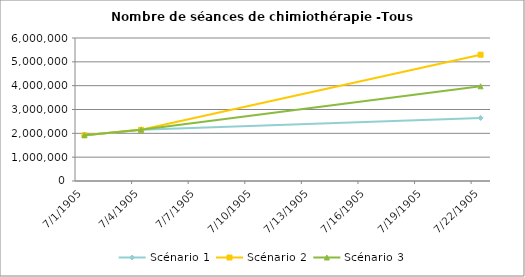
| Category | Scénario 1 | Scénario 2 | Scénario 3 |
|---|---|---|---|
| 2009.0 | 1921086 | 1921086 | 1921086 |
| 2012.0 | 2148475 | 2148475 | 2148475 |
| 2030.0 | 2645833.729 | 5298380.439 | 3973785.329 |